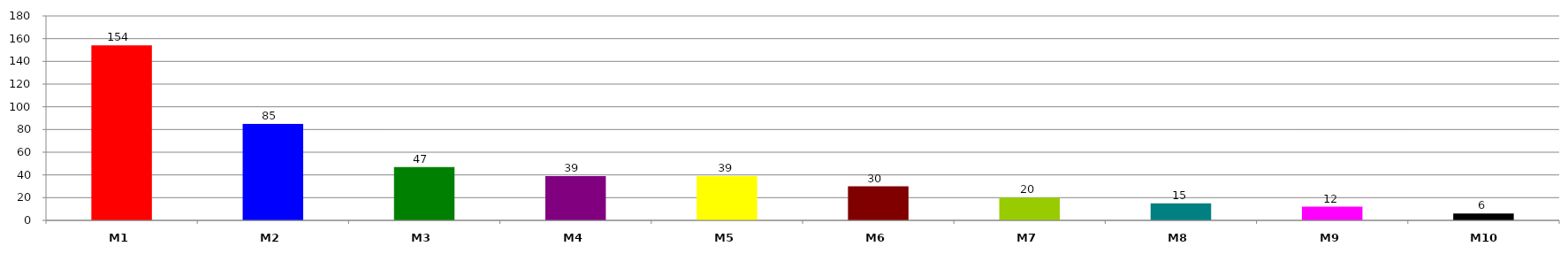
| Category | Series 0 |
|---|---|
| M1 | 154 |
| M2 | 85 |
| M3 | 47 |
| M4 | 39 |
| M5 | 39 |
| M6 | 30 |
| M7 | 20 |
| M8 | 15 |
| M9 | 12 |
| M10 | 6 |